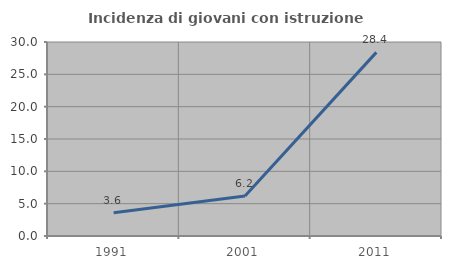
| Category | Incidenza di giovani con istruzione universitaria |
|---|---|
| 1991.0 | 3.604 |
| 2001.0 | 6.173 |
| 2011.0 | 28.395 |